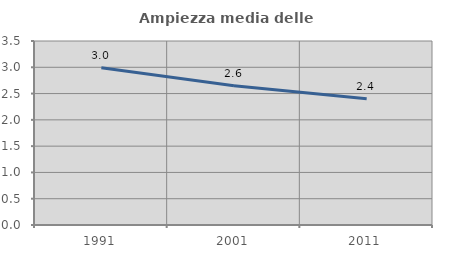
| Category | Ampiezza media delle famiglie |
|---|---|
| 1991.0 | 2.99 |
| 2001.0 | 2.648 |
| 2011.0 | 2.401 |